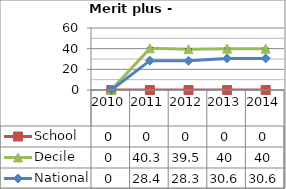
| Category | School  | Decile | National |
|---|---|---|---|
| 2010.0 | 0 | 0 | 0 |
| 2011.0 | 0 | 40.3 | 28.4 |
| 2012.0 | 0 | 39.5 | 28.3 |
| 2013.0 | 0 | 40 | 30.6 |
| 2014.0 | 0 | 40 | 30.6 |